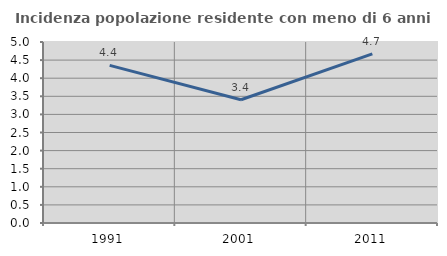
| Category | Incidenza popolazione residente con meno di 6 anni |
|---|---|
| 1991.0 | 4.353 |
| 2001.0 | 3.404 |
| 2011.0 | 4.67 |